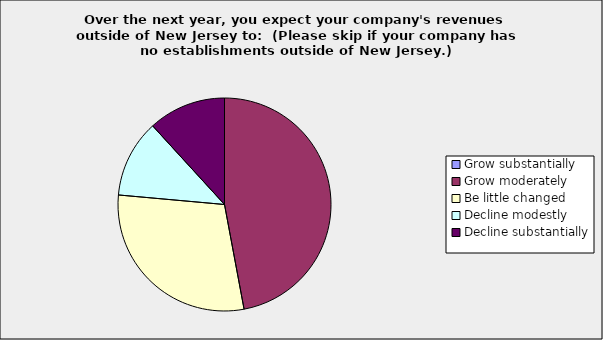
| Category | Series 0 |
|---|---|
| Grow substantially | 0 |
| Grow moderately | 0.471 |
| Be little changed | 0.294 |
| Decline modestly | 0.118 |
| Decline substantially | 0.118 |